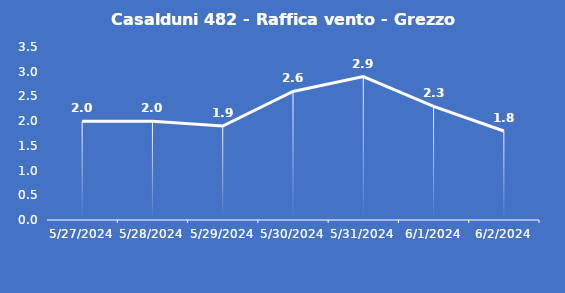
| Category | Casalduni 482 - Raffica vento - Grezzo (m/s) |
|---|---|
| 5/27/24 | 2 |
| 5/28/24 | 2 |
| 5/29/24 | 1.9 |
| 5/30/24 | 2.6 |
| 5/31/24 | 2.9 |
| 6/1/24 | 2.3 |
| 6/2/24 | 1.8 |